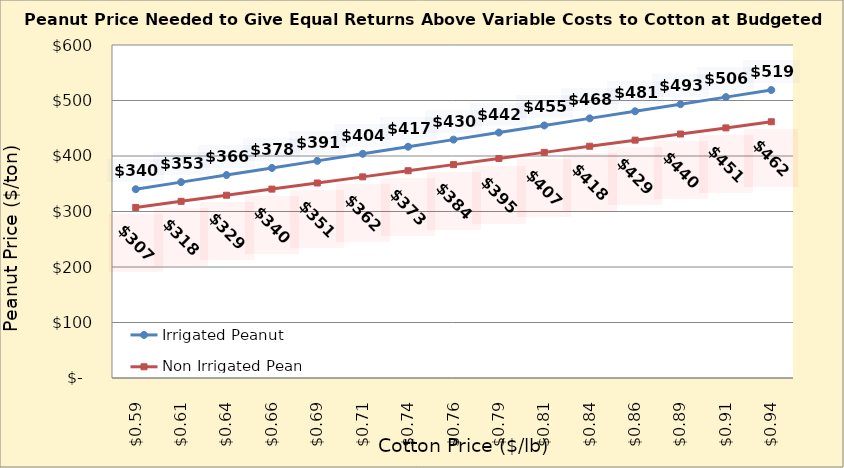
| Category | Irrigated Peanut | Non Irrigated Peanut |
|---|---|---|
| 0.5849999999999999 | 340.153 | 307.256 |
| 0.6099999999999999 | 352.919 | 318.285 |
| 0.6349999999999999 | 365.685 | 329.314 |
| 0.6599999999999999 | 378.451 | 340.344 |
| 0.6849999999999999 | 391.217 | 351.373 |
| 0.71 | 403.983 | 362.403 |
| 0.735 | 416.749 | 373.432 |
| 0.76 | 429.515 | 384.461 |
| 0.785 | 442.281 | 395.491 |
| 0.81 | 455.047 | 406.52 |
| 0.8350000000000001 | 467.813 | 417.55 |
| 0.8600000000000001 | 480.578 | 428.579 |
| 0.8850000000000001 | 493.344 | 439.608 |
| 0.9100000000000001 | 506.11 | 450.638 |
| 0.9350000000000002 | 518.876 | 461.667 |